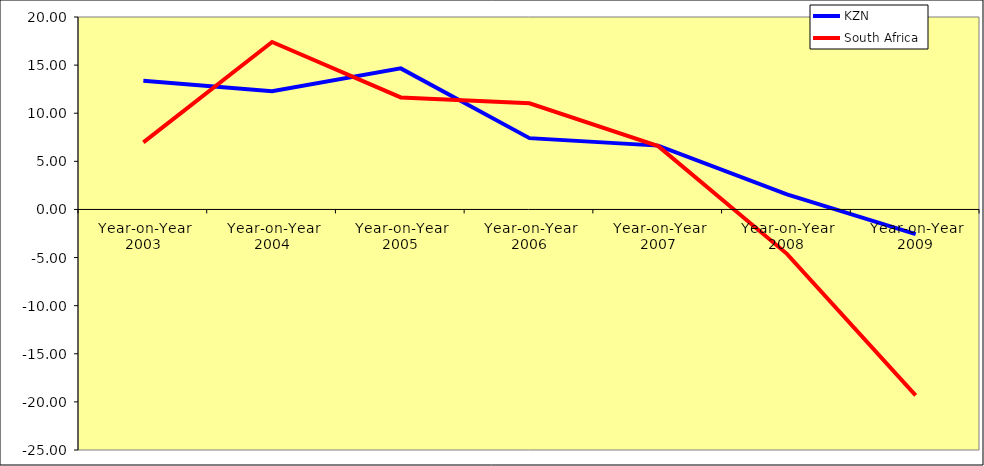
| Category | KZN | South Africa |
|---|---|---|
| Year-on-Year 2003 | 13.364 | 6.968 |
| Year-on-Year 2004 | 12.287 | 17.405 |
| Year-on-Year 2005 | 14.661 | 11.642 |
| Year-on-Year 2006 | 7.409 | 11.036 |
| Year-on-Year 2007 | 6.632 | 6.582 |
| Year-on-Year 2008 | 1.562 | -4.612 |
| Year-on-Year 2009 | -2.571 | -19.319 |